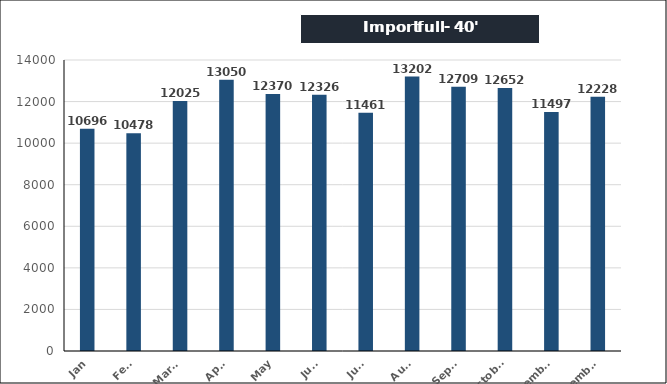
| Category | Import full - 40' |
|---|---|
| Jan | 10696 |
| Feb. | 10478 |
| March | 12025 |
| April | 13050 |
| May | 12370 |
| June | 12326 |
| July | 11461 |
| Aug. | 13202 |
| Sept. | 12709 |
| October | 12652 |
| November | 11497 |
| December | 12228 |